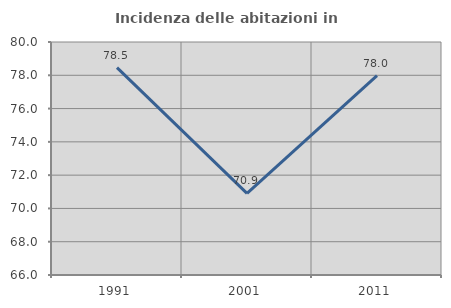
| Category | Incidenza delle abitazioni in proprietà  |
|---|---|
| 1991.0 | 78.462 |
| 2001.0 | 70.909 |
| 2011.0 | 77.982 |